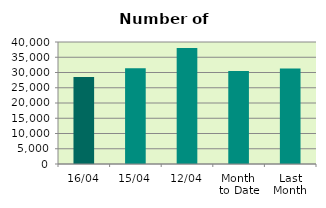
| Category | Series 0 |
|---|---|
| 16/04 | 28550 |
| 15/04 | 31366 |
| 12/04 | 38004 |
| Month 
to Date | 30530.667 |
| Last
Month | 31344.095 |